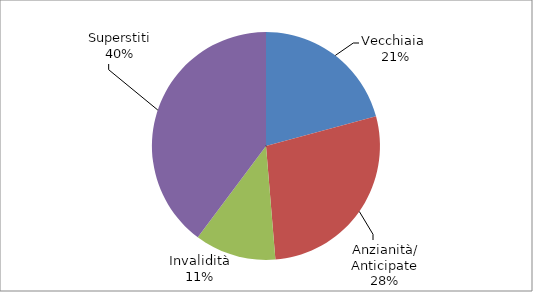
| Category | Series 0 |
|---|---|
| Vecchiaia  | 8987 |
| Anzianità/ Anticipate | 12061 |
| Invalidità | 4983 |
| Superstiti | 17201 |